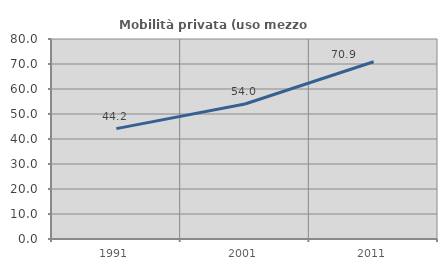
| Category | Mobilità privata (uso mezzo privato) |
|---|---|
| 1991.0 | 44.16 |
| 2001.0 | 53.985 |
| 2011.0 | 70.896 |